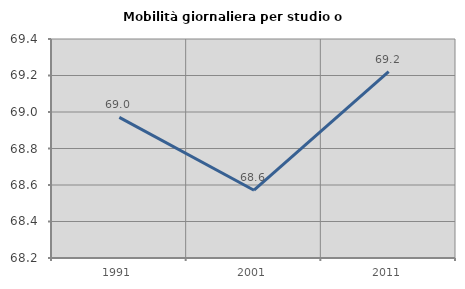
| Category | Mobilità giornaliera per studio o lavoro |
|---|---|
| 1991.0 | 68.971 |
| 2001.0 | 68.571 |
| 2011.0 | 69.221 |